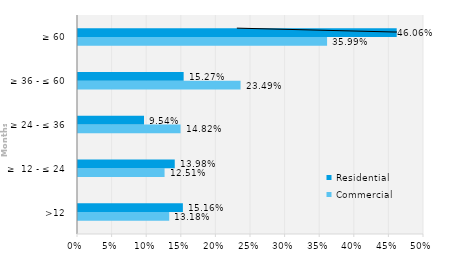
| Category | Commercial | Residential |
|---|---|---|
| >12 | 0.132 | 0.152 |
| ≥  12 - ≤ 24 | 0.125 | 0.14 |
| ≥ 24 - ≤ 36 | 0.148 | 0.095 |
| ≥ 36 - ≤ 60 | 0.235 | 0.153 |
| ≥ 60 | 0.36 | 0.461 |